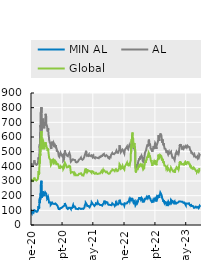
| Category | MIN AL | AL | Global |
|---|---|---|---|
| 2020-01-01 | 81 | 398 | 298 |
| 2020-01-02 | 85 | 407 | 303 |
| 2020-01-03 | 91 | 420 | 314 |
| 2020-01-06 | 87 | 416 | 311 |
| 2020-01-07 | 87 | 414 | 308 |
| 2020-01-08 | 81 | 408 | 301 |
| 2020-01-09 | 87 | 407 | 303 |
| 2020-01-10 | 89 | 406 | 304 |
| 2020-01-13 | 87 | 405 | 302 |
| 2020-01-14 | 88 | 409 | 303 |
| 2020-01-15 | 88 | 407 | 302 |
| 2020-01-16 | 85 | 404 | 299 |
| 2020-01-17 | 83 | 404 | 298 |
| 2020-01-20 | 83 | 404 | 298 |
| 2020-01-21 | 88 | 415 | 305 |
| 2020-01-22 | 89 | 419 | 305 |
| 2020-01-23 | 92 | 423 | 308 |
| 2020-01-24 | 95 | 432 | 314 |
| 2020-01-27 | 101 | 441 | 323 |
| 2020-01-28 | 95 | 433 | 315 |
| 2020-01-29 | 99 | 429 | 315 |
| 2020-01-30 | 95 | 427 | 314 |
| 2020-01-31 | 96 | 430 | 317 |
| 2020-02-03 | 97 | 427 | 314 |
| 2020-02-04 | 97 | 418 | 308 |
| 2020-02-05 | 92 | 412 | 303 |
| 2020-02-06 | 92 | 413 | 303 |
| 2020-02-07 | 96 | 413 | 308 |
| 2020-02-10 | 98 | 415 | 312 |
| 2020-02-11 | 94 | 416 | 308 |
| 2020-02-12 | 90 | 410 | 303 |
| 2020-02-13 | 91 | 415 | 305 |
| 2020-02-14 | 92 | 412 | 304 |
| 2020-02-17 | 92 | 412 | 304 |
| 2020-02-18 | 94 | 414 | 305 |
| 2020-02-19 | 91 | 408 | 302 |
| 2020-02-20 | 92 | 415 | 309 |
| 2020-02-21 | 94 | 415 | 310 |
| 2020-02-24 | 98 | 422 | 317 |
| 2020-02-25 | 104 | 430 | 325 |
| 2020-02-26 | 106 | 433 | 328 |
| 2020-02-27 | 112 | 449 | 341 |
| 2020-02-28 | 129 | 461 | 367 |
| 2020-03-02 | 126 | 454 | 362 |
| 2020-03-03 | 123 | 448 | 356 |
| 2020-03-04 | 112 | 433 | 343 |
| 2020-03-05 | 120 | 455 | 358 |
| 2020-03-06 | 139 | 477 | 387 |
| 2020-03-09 | 180 | 550 | 447 |
| 2020-03-10 | 150 | 529 | 419 |
| 2020-03-11 | 172 | 559 | 435 |
| 2020-03-12 | 191 | 627 | 489 |
| 2020-03-13 | 174 | 601 | 473 |
| 2020-03-16 | 215 | 680 | 536 |
| 2020-03-17 | 213 | 667 | 523 |
| 2020-03-18 | 274 | 767 | 588 |
| 2020-03-19 | 287 | 799 | 622 |
| 2020-03-20 | 282 | 765 | 603 |
| 2020-03-23 | 302 | 803 | 641 |
| 2020-03-24 | 276 | 760 | 606 |
| 2020-03-25 | 218 | 676 | 542 |
| 2020-03-26 | 186 | 644 | 516 |
| 2020-03-27 | 208 | 687 | 543 |
| 2020-03-30 | 208 | 692 | 560 |
| 2020-03-31 | 195 | 672 | 543 |
| 2020-04-01 | 211 | 710 | 571 |
| 2020-04-02 | 218 | 714 | 572 |
| 2020-04-03 | 229 | 725 | 579 |
| 2020-04-06 | 224 | 714 | 571 |
| 2020-04-07 | 215 | 706 | 557 |
| 2020-04-08 | 215 | 709 | 557 |
| 2020-04-09 | 207 | 674 | 532 |
| 2020-04-10 | 207 | 674 | 532 |
| 2020-04-13 | 197 | 659 | 524 |
| 2020-04-14 | 194 | 653 | 516 |
| 2020-04-15 | 213 | 685 | 541 |
| 2020-04-16 | 223 | 701 | 550 |
| 2020-04-17 | 213 | 679 | 537 |
| 2020-04-20 | 214 | 686 | 540 |
| 2020-04-21 | 223 | 710 | 557 |
| 2020-04-22 | 222 | 723 | 560 |
| 2020-04-23 | 225 | 742 | 565 |
| 2020-04-24 | 227 | 758 | 570 |
| 2020-04-27 | 220 | 762 | 566 |
| 2020-04-28 | 220 | 759 | 569 |
| 2020-04-29 | 213 | 739 | 559 |
| 2020-04-30 | 200 | 688 | 536 |
| 2020-05-01 | 197 | 690 | 538 |
| 2020-05-04 | 195 | 692 | 540 |
| 2020-05-05 | 189 | 676 | 528 |
| 2020-05-06 | 181 | 673 | 525 |
| 2020-05-07 | 187 | 667 | 528 |
| 2020-05-08 | 182 | 651 | 516 |
| 2020-05-11 | 177 | 637 | 504 |
| 2020-05-12 | 182 | 638 | 503 |
| 2020-05-13 | 193 | 654 | 512 |
| 2020-05-14 | 196 | 661 | 521 |
| 2020-05-15 | 188 | 645 | 510 |
| 2020-05-18 | 171 | 613 | 486 |
| 2020-05-19 | 169 | 613 | 483 |
| 2020-05-20 | 162 | 601 | 472 |
| 2020-05-21 | 154 | 586 | 461 |
| 2020-05-22 | 154 | 588 | 466 |
| 2020-05-25 | 154 | 588 | 466 |
| 2020-05-26 | 149 | 565 | 452 |
| 2020-05-27 | 151 | 569 | 454 |
| 2020-05-28 | 149 | 568 | 453 |
| 2020-05-29 | 155 | 567 | 456 |
| 2020-06-01 | 153 | 562 | 451 |
| 2020-06-02 | 148 | 550 | 441 |
| 2020-06-03 | 137 | 528 | 420 |
| 2020-06-04 | 136 | 531 | 418 |
| 2020-06-05 | 133 | 526 | 409 |
| 2020-06-08 | 132 | 519 | 406 |
| 2020-06-09 | 136 | 531 | 416 |
| 2020-06-10 | 145 | 538 | 424 |
| 2020-06-11 | 158 | 568 | 446 |
| 2020-06-12 | 156 | 563 | 443 |
| 2020-06-15 | 159 | 566 | 448 |
| 2020-06-16 | 147 | 545 | 428 |
| 2020-06-17 | 150 | 552 | 431 |
| 2020-06-18 | 151 | 557 | 436 |
| 2020-06-19 | 149 | 552 | 433 |
| 2020-06-22 | 149 | 551 | 432 |
| 2020-06-23 | 145 | 545 | 428 |
| 2020-06-24 | 145 | 553 | 435 |
| 2020-06-25 | 144 | 554 | 438 |
| 2020-06-26 | 151 | 560 | 442 |
| 2020-06-29 | 151 | 558 | 442 |
| 2020-06-30 | 149 | 554 | 441 |
| 2020-07-01 | 145 | 548 | 434 |
| 2020-07-02 | 143 | 543 | 430 |
| 2020-07-03 | 143 | 543 | 430 |
| 2020-07-06 | 140 | 530 | 425 |
| 2020-07-07 | 144 | 535 | 430 |
| 2020-07-08 | 143 | 532 | 429 |
| 2020-07-09 | 148 | 543 | 437 |
| 2020-07-10 | 147 | 539 | 437 |
| 2020-07-13 | 145 | 536 | 435 |
| 2020-07-14 | 147 | 544 | 441 |
| 2020-07-15 | 144 | 535 | 433 |
| 2020-07-16 | 145 | 534 | 433 |
| 2020-07-17 | 141 | 526 | 428 |
| 2020-07-20 | 138 | 518 | 423 |
| 2020-07-21 | 135 | 509 | 415 |
| 2020-07-22 | 132 | 501 | 411 |
| 2020-07-23 | 133 | 508 | 412 |
| 2020-07-24 | 135 | 510 | 416 |
| 2020-07-27 | 131 | 507 | 412 |
| 2020-07-28 | 134 | 511 | 420 |
| 2020-07-29 | 125 | 505 | 416 |
| 2020-07-30 | 125 | 506 | 421 |
| 2020-07-31 | 120 | 499 | 416 |
| 2020-08-03 | 116 | 494 | 411 |
| 2020-08-04 | 117 | 484 | 408 |
| 2020-08-05 | 109 | 472 | 400 |
| 2020-08-06 | 108 | 469 | 400 |
| 2020-08-07 | 109 | 470 | 397 |
| 2020-08-10 | 110 | 465 | 392 |
| 2020-08-11 | 109 | 461 | 383 |
| 2020-08-12 | 111 | 467 | 385 |
| 2020-08-13 | 108 | 468 | 383 |
| 2020-08-14 | 111 | 476 | 389 |
| 2020-08-17 | 113 | 480 | 395 |
| 2020-08-18 | 115 | 484 | 399 |
| 2020-08-19 | 113 | 485 | 395 |
| 2020-08-20 | 117 | 492 | 402 |
| 2020-08-21 | 118 | 489 | 400 |
| 2020-08-24 | 116 | 484 | 396 |
| 2020-08-25 | 116 | 488 | 397 |
| 2020-08-26 | 116 | 490 | 399 |
| 2020-08-27 | 117 | 489 | 395 |
| 2020-08-28 | 116 | 484 | 396 |
| 2020-08-31 | 119 | 478 | 397 |
| 2020-09-01 | 119 | 471 | 393 |
| 2020-09-02 | 119 | 469 | 389 |
| 2020-09-03 | 122 | 476 | 395 |
| 2020-09-04 | 116 | 472 | 390 |
| 2020-09-07 | 116 | 472 | 390 |
| 2020-09-08 | 118 | 478 | 397 |
| 2020-09-09 | 116 | 474 | 393 |
| 2020-09-10 | 119 | 439 | 381 |
| 2020-09-11 | 127 | 442 | 384 |
| 2020-09-14 | 127 | 443 | 385 |
| 2020-09-15 | 124 | 440 | 382 |
| 2020-09-16 | 122 | 447 | 384 |
| 2020-09-17 | 125 | 459 | 392 |
| 2020-09-18 | 125 | 464 | 395 |
| 2020-09-21 | 134 | 485 | 412 |
| 2020-09-22 | 140 | 492 | 417 |
| 2020-09-23 | 150 | 509 | 424 |
| 2020-09-24 | 149 | 504 | 426 |
| 2020-09-25 | 142 | 497 | 420 |
| 2020-09-28 | 138 | 495 | 420 |
| 2020-09-29 | 140 | 497 | 420 |
| 2020-09-30 | 135 | 486 | 412 |
| 2020-10-01 | 136 | 492 | 413 |
| 2020-10-02 | 132 | 491 | 412 |
| 2020-10-05 | 125 | 483 | 403 |
| 2020-10-06 | 127 | 486 | 405 |
| 2020-10-07 | 121 | 481 | 400 |
| 2020-10-08 | 115 | 474 | 399 |
| 2020-10-09 | 112 | 468 | 393 |
| 2020-10-12 | 112 | 468 | 393 |
| 2020-10-13 | 116 | 472 | 396 |
| 2020-10-14 | 114 | 472 | 397 |
| 2020-10-15 | 110 | 472 | 397 |
| 2020-10-16 | 109 | 469 | 395 |
| 2020-10-19 | 110 | 475 | 395 |
| 2020-10-20 | 110 | 475 | 394 |
| 2020-10-21 | 113 | 481 | 396 |
| 2020-10-22 | 114 | 480 | 397 |
| 2020-10-23 | 117 | 481 | 398 |
| 2020-10-26 | 118 | 486 | 404 |
| 2020-10-27 | 117 | 485 | 404 |
| 2020-10-28 | 119 | 492 | 410 |
| 2020-10-29 | 117 | 491 | 408 |
| 2020-10-30 | 116 | 485 | 404 |
| 2020-11-02 | 118 | 483 | 406 |
| 2020-11-03 | 114 | 475 | 400 |
| 2020-11-04 | 114 | 465 | 396 |
| 2020-11-05 | 113 | 455 | 382 |
| 2020-11-06 | 116 | 452 | 380 |
| 2020-11-09 | 109 | 432 | 356 |
| 2020-11-10 | 116 | 433 | 358 |
| 2020-11-11 | 116 | 433 | 358 |
| 2020-11-12 | 113 | 435 | 357 |
| 2020-11-13 | 114 | 434 | 355 |
| 2020-11-16 | 119 | 432 | 352 |
| 2020-11-17 | 117 | 441 | 360 |
| 2020-11-18 | 116 | 441 | 358 |
| 2020-11-19 | 118 | 445 | 360 |
| 2020-11-20 | 116 | 445 | 362 |
| 2020-11-23 | 125 | 446 | 361 |
| 2020-11-24 | 128 | 445 | 360 |
| 2020-11-25 | 131 | 448 | 361 |
| 2020-11-26 | 131 | 448 | 361 |
| 2020-11-27 | 136 | 449 | 363 |
| 2020-11-30 | 132 | 453 | 363 |
| 2020-12-01 | 123 | 444 | 354 |
| 2020-12-02 | 122 | 444 | 353 |
| 2020-12-03 | 123 | 444 | 353 |
| 2020-12-04 | 122 | 441 | 347 |
| 2020-12-07 | 126 | 448 | 353 |
| 2020-12-08 | 128 | 450 | 356 |
| 2020-12-09 | 126 | 447 | 354 |
| 2020-12-10 | 129 | 446 | 356 |
| 2020-12-11 | 129 | 443 | 355 |
| 2020-12-14 | 127 | 439 | 353 |
| 2020-12-15 | 118 | 436 | 348 |
| 2020-12-16 | 114 | 432 | 344 |
| 2020-12-17 | 111 | 429 | 340 |
| 2020-12-18 | 109 | 426 | 338 |
| 2020-12-21 | 109 | 429 | 341 |
| 2020-12-22 | 110 | 429 | 342 |
| 2020-12-23 | 107 | 425 | 338 |
| 2020-12-24 | 110 | 427 | 340 |
| 2020-12-25 | 110 | 427 | 340 |
| 2020-12-28 | 110 | 427 | 340 |
| 2020-12-29 | 109 | 427 | 338 |
| 2020-12-30 | 110 | 427 | 338 |
| 2020-12-31 | 109 | 427 | 338 |
| 2021-01-01 | 109 | 427 | 338 |
| 2021-01-04 | 108 | 433 | 340 |
| 2021-01-05 | 107 | 436 | 342 |
| 2021-01-06 | 105 | 433 | 339 |
| 2021-01-07 | 105 | 433 | 339 |
| 2021-01-08 | 102 | 432 | 337 |
| 2021-01-11 | 107 | 438 | 341 |
| 2021-01-12 | 115 | 446 | 349 |
| 2021-01-13 | 112 | 450 | 350 |
| 2021-01-14 | 110 | 449 | 346 |
| 2021-01-15 | 112 | 452 | 351 |
| 2021-01-18 | 112 | 452 | 351 |
| 2021-01-19 | 112 | 451 | 350 |
| 2021-01-20 | 112 | 450 | 349 |
| 2021-01-21 | 110 | 452 | 348 |
| 2021-01-22 | 109 | 451 | 350 |
| 2021-01-25 | 110 | 454 | 353 |
| 2021-01-26 | 109 | 454 | 352 |
| 2021-01-27 | 111 | 459 | 355 |
| 2021-01-28 | 109 | 456 | 353 |
| 2021-01-29 | 105 | 452 | 349 |
| 2021-02-01 | 109 | 452 | 349 |
| 2021-02-02 | 108 | 449 | 346 |
| 2021-02-03 | 110 | 452 | 346 |
| 2021-02-04 | 115 | 451 | 345 |
| 2021-02-05 | 112 | 446 | 339 |
| 2021-02-08 | 113 | 445 | 341 |
| 2021-02-09 | 112 | 446 | 341 |
| 2021-02-10 | 114 | 448 | 343 |
| 2021-02-11 | 111 | 446 | 340 |
| 2021-02-12 | 110 | 444 | 337 |
| 2021-02-15 | 110 | 444 | 337 |
| 2021-02-16 | 112 | 452 | 342 |
| 2021-02-17 | 113 | 450 | 344 |
| 2021-02-18 | 115 | 452 | 344 |
| 2021-02-19 | 114 | 453 | 343 |
| 2021-02-22 | 118 | 464 | 351 |
| 2021-02-23 | 123 | 467 | 355 |
| 2021-02-24 | 123 | 463 | 352 |
| 2021-02-25 | 125 | 468 | 352 |
| 2021-02-26 | 133 | 475 | 365 |
| 2021-03-01 | 129 | 470 | 357 |
| 2021-03-02 | 135 | 477 | 362 |
| 2021-03-03 | 136 | 477 | 361 |
| 2021-03-04 | 143 | 478 | 361 |
| 2021-03-05 | 152 | 493 | 374 |
| 2021-03-08 | 157 | 506 | 385 |
| 2021-03-09 | 155 | 508 | 387 |
| 2021-03-10 | 151 | 500 | 382 |
| 2021-03-11 | 144 | 492 | 370 |
| 2021-03-12 | 138 | 484 | 366 |
| 2021-03-15 | 137 | 480 | 365 |
| 2021-03-16 | 131 | 471 | 358 |
| 2021-03-17 | 131 | 469 | 360 |
| 2021-03-18 | 129 | 468 | 356 |
| 2021-03-19 | 127 | 465 | 353 |
| 2021-03-22 | 131 | 465 | 366 |
| 2021-03-23 | 131 | 466 | 370 |
| 2021-03-24 | 133 | 474 | 373 |
| 2021-03-25 | 132 | 478 | 374 |
| 2021-03-26 | 130 | 477 | 373 |
| 2021-03-29 | 125 | 476 | 369 |
| 2021-03-30 | 131 | 481 | 377 |
| 2021-03-31 | 125 | 471 | 370 |
| 2021-04-01 | 124 | 469 | 369 |
| 2021-04-02 | 124 | 469 | 369 |
| 2021-04-05 | 121 | 465 | 365 |
| 2021-04-06 | 121 | 467 | 368 |
| 2021-04-07 | 122 | 470 | 368 |
| 2021-04-08 | 124 | 473 | 370 |
| 2021-04-09 | 125 | 473 | 367 |
| 2021-04-12 | 133 | 471 | 366 |
| 2021-04-13 | 138 | 475 | 372 |
| 2021-04-14 | 134 | 470 | 364 |
| 2021-04-15 | 135 | 472 | 368 |
| 2021-04-16 | 130 | 469 | 361 |
| 2021-04-19 | 136 | 469 | 357 |
| 2021-04-20 | 147 | 476 | 366 |
| 2021-04-21 | 155 | 477 | 366 |
| 2021-04-22 | 160 | 478 | 365 |
| 2021-04-23 | 152 | 476 | 364 |
| 2021-04-26 | 157 | 476 | 366 |
| 2021-04-27 | 154 | 474 | 363 |
| 2021-04-28 | 150 | 474 | 366 |
| 2021-04-29 | 144 | 471 | 363 |
| 2021-04-30 | 138 | 465 | 360 |
| 2021-05-03 | 138 | 469 | 362 |
| 2021-05-04 | 141 | 469 | 363 |
| 2021-05-05 | 149 | 472 | 364 |
| 2021-05-06 | 149 | 470 | 362 |
| 2021-05-07 | 137 | 462 | 354 |
| 2021-05-10 | 133 | 458 | 350 |
| 2021-05-11 | 132 | 462 | 353 |
| 2021-05-12 | 131 | 463 | 352 |
| 2021-05-13 | 130 | 462 | 356 |
| 2021-05-14 | 129 | 458 | 352 |
| 2021-05-17 | 127 | 455 | 349 |
| 2021-05-18 | 126 | 453 | 348 |
| 2021-05-19 | 130 | 456 | 349 |
| 2021-05-20 | 133 | 460 | 353 |
| 2021-05-21 | 139 | 462 | 353 |
| 2021-05-24 | 147 | 464 | 354 |
| 2021-05-25 | 150 | 467 | 356 |
| 2021-05-26 | 146 | 462 | 353 |
| 2021-05-27 | 145 | 460 | 350 |
| 2021-05-28 | 143 | 459 | 351 |
| 2021-05-31 | 143 | 459 | 351 |
| 2021-06-01 | 142 | 457 | 349 |
| 2021-06-02 | 142 | 454 | 348 |
| 2021-06-03 | 140 | 457 | 349 |
| 2021-06-04 | 142 | 459 | 353 |
| 2021-06-07 | 156 | 460 | 352 |
| 2021-06-08 | 152 | 457 | 351 |
| 2021-06-09 | 149 | 454 | 348 |
| 2021-06-10 | 151 | 456 | 349 |
| 2021-06-11 | 147 | 452 | 345 |
| 2021-06-14 | 145 | 454 | 345 |
| 2021-06-15 | 145 | 457 | 348 |
| 2021-06-16 | 144 | 455 | 345 |
| 2021-06-17 | 143 | 456 | 351 |
| 2021-06-18 | 148 | 461 | 353 |
| 2021-06-21 | 142 | 461 | 351 |
| 2021-06-22 | 144 | 465 | 355 |
| 2021-06-23 | 142 | 464 | 352 |
| 2021-06-24 | 141 | 467 | 354 |
| 2021-06-25 | 137 | 466 | 351 |
| 2021-06-28 | 137 | 469 | 355 |
| 2021-06-29 | 137 | 470 | 356 |
| 2021-06-30 | 134 | 463 | 356 |
| 2021-07-01 | 134 | 463 | 356 |
| 2021-07-02 | 137 | 467 | 360 |
| 2021-07-05 | 137 | 467 | 360 |
| 2021-07-06 | 137 | 472 | 364 |
| 2021-07-07 | 139 | 472 | 365 |
| 2021-07-08 | 138 | 474 | 368 |
| 2021-07-09 | 134 | 471 | 363 |
| 2021-07-12 | 134 | 472 | 362 |
| 2021-07-13 | 132 | 470 | 360 |
| 2021-07-14 | 133 | 471 | 363 |
| 2021-07-15 | 137 | 474 | 365 |
| 2021-07-16 | 135 | 471 | 363 |
| 2021-07-19 | 143 | 480 | 374 |
| 2021-07-20 | 141 | 477 | 370 |
| 2021-07-21 | 141 | 476 | 366 |
| 2021-07-22 | 143 | 478 | 369 |
| 2021-07-23 | 143 | 475 | 367 |
| 2021-07-26 | 144 | 477 | 368 |
| 2021-07-27 | 151 | 485 | 374 |
| 2021-07-28 | 154 | 485 | 374 |
| 2021-07-29 | 158 | 482 | 371 |
| 2021-07-30 | 166 | 476 | 368 |
| 2021-08-02 | 162 | 477 | 369 |
| 2021-08-03 | 156 | 476 | 368 |
| 2021-08-04 | 155 | 475 | 367 |
| 2021-08-05 | 151 | 470 | 364 |
| 2021-08-06 | 148 | 469 | 361 |
| 2021-08-09 | 148 | 470 | 362 |
| 2021-08-10 | 152 | 469 | 360 |
| 2021-08-11 | 153 | 470 | 362 |
| 2021-08-12 | 152 | 465 | 357 |
| 2021-08-13 | 157 | 471 | 362 |
| 2021-08-16 | 158 | 476 | 364 |
| 2021-08-17 | 157 | 475 | 363 |
| 2021-08-18 | 155 | 475 | 364 |
| 2021-08-19 | 156 | 480 | 368 |
| 2021-08-20 | 153 | 478 | 366 |
| 2021-08-23 | 154 | 475 | 365 |
| 2021-08-24 | 147 | 469 | 360 |
| 2021-08-25 | 142 | 463 | 354 |
| 2021-08-26 | 146 | 464 | 356 |
| 2021-08-27 | 145 | 463 | 356 |
| 2021-08-30 | 144 | 457 | 354 |
| 2021-08-31 | 138 | 458 | 350 |
| 2021-09-01 | 138 | 456 | 349 |
| 2021-09-02 | 141 | 455 | 349 |
| 2021-09-03 | 138 | 455 | 348 |
| 2021-09-06 | 138 | 455 | 348 |
| 2021-09-07 | 135 | 453 | 346 |
| 2021-09-08 | 138 | 459 | 350 |
| 2021-09-09 | 138 | 463 | 354 |
| 2021-09-10 | 137 | 462 | 351 |
| 2021-09-13 | 138 | 459 | 352 |
| 2021-09-14 | 143 | 465 | 357 |
| 2021-09-15 | 138 | 460 | 353 |
| 2021-09-16 | 136 | 460 | 353 |
| 2021-09-17 | 134 | 461 | 354 |
| 2021-09-20 | 142 | 477 | 367 |
| 2021-09-21 | 140 | 477 | 365 |
| 2021-09-22 | 140 | 479 | 367 |
| 2021-09-23 | 134 | 475 | 362 |
| 2021-09-24 | 135 | 481 | 367 |
| 2021-09-27 | 136 | 485 | 370 |
| 2021-09-28 | 137 | 486 | 371 |
| 2021-09-29 | 140 | 484 | 369 |
| 2021-09-30 | 148 | 489 | 373 |
| 2021-10-01 | 153 | 492 | 379 |
| 2021-10-04 | 153 | 493 | 379 |
| 2021-10-05 | 151 | 488 | 377 |
| 2021-10-06 | 153 | 490 | 382 |
| 2021-10-07 | 141 | 484 | 373 |
| 2021-10-08 | 139 | 485 | 374 |
| 2021-10-11 | 139 | 485 | 374 |
| 2021-10-12 | 143 | 489 | 380 |
| 2021-10-13 | 142 | 488 | 378 |
| 2021-10-14 | 139 | 486 | 377 |
| 2021-10-15 | 139 | 483 | 371 |
| 2021-10-18 | 141 | 486 | 374 |
| 2021-10-19 | 134 | 481 | 367 |
| 2021-10-20 | 130 | 483 | 369 |
| 2021-10-21 | 130 | 487 | 371 |
| 2021-10-22 | 129 | 490 | 374 |
| 2021-10-25 | 128 | 490 | 374 |
| 2021-10-26 | 132 | 489 | 373 |
| 2021-10-27 | 135 | 489 | 375 |
| 2021-10-28 | 141 | 493 | 374 |
| 2021-10-29 | 150 | 498 | 381 |
| 2021-11-01 | 150 | 502 | 381 |
| 2021-11-02 | 152 | 507 | 385 |
| 2021-11-03 | 143 | 502 | 379 |
| 2021-11-04 | 147 | 505 | 381 |
| 2021-11-05 | 150 | 504 | 380 |
| 2021-11-08 | 142 | 493 | 367 |
| 2021-11-09 | 145 | 496 | 373 |
| 2021-11-10 | 142 | 495 | 368 |
| 2021-11-11 | 142 | 495 | 368 |
| 2021-11-12 | 143 | 495 | 371 |
| 2021-11-15 | 140 | 489 | 366 |
| 2021-11-16 | 141 | 493 | 371 |
| 2021-11-17 | 143 | 496 | 375 |
| 2021-11-18 | 144 | 500 | 378 |
| 2021-11-19 | 146 | 500 | 380 |
| 2021-11-22 | 143 | 501 | 378 |
| 2021-11-23 | 147 | 509 | 387 |
| 2021-11-24 | 153 | 516 | 391 |
| 2021-11-25 | 153 | 516 | 391 |
| 2021-11-26 | 172 | 543 | 415 |
| 2021-11-29 | 164 | 538 | 410 |
| 2021-11-30 | 164 | 543 | 414 |
| 2021-12-01 | 160 | 527 | 408 |
| 2021-12-02 | 156 | 520 | 401 |
| 2021-12-03 | 161 | 519 | 405 |
| 2021-12-06 | 153 | 510 | 394 |
| 2021-12-07 | 145 | 497 | 383 |
| 2021-12-08 | 141 | 495 | 377 |
| 2021-12-09 | 141 | 496 | 381 |
| 2021-12-10 | 139 | 499 | 383 |
| 2021-12-13 | 143 | 504 | 389 |
| 2021-12-14 | 141 | 501 | 388 |
| 2021-12-15 | 140 | 501 | 387 |
| 2021-12-16 | 142 | 506 | 391 |
| 2021-12-17 | 144 | 508 | 397 |
| 2021-12-20 | 144 | 514 | 404 |
| 2021-12-21 | 143 | 511 | 400 |
| 2021-12-22 | 146 | 513 | 402 |
| 2021-12-23 | 142 | 510 | 394 |
| 2021-12-24 | 142 | 510 | 394 |
| 2021-12-27 | 143 | 508 | 394 |
| 2021-12-28 | 142 | 504 | 392 |
| 2021-12-29 | 136 | 497 | 385 |
| 2021-12-30 | 139 | 500 | 388 |
| 2021-12-31 | 140 | 492 | 386 |
| 2022-01-03 | 132 | 487 | 378 |
| 2022-01-04 | 135 | 494 | 382 |
| 2022-01-05 | 139 | 498 | 383 |
| 2022-01-06 | 148 | 508 | 394 |
| 2022-01-07 | 148 | 512 | 396 |
| 2022-01-10 | 152 | 517 | 403 |
| 2022-01-11 | 153 | 518 | 402 |
| 2022-01-12 | 150 | 516 | 399 |
| 2022-01-13 | 152 | 522 | 408 |
| 2022-01-14 | 146 | 522 | 409 |
| 2022-01-17 | 146 | 522 | 409 |
| 2022-01-18 | 148 | 526 | 415 |
| 2022-01-19 | 148 | 523 | 413 |
| 2022-01-20 | 144 | 522 | 410 |
| 2022-01-21 | 150 | 529 | 415 |
| 2022-01-24 | 148 | 535 | 425 |
| 2022-01-25 | 146 | 531 | 423 |
| 2022-01-26 | 143 | 525 | 415 |
| 2022-01-27 | 151 | 531 | 416 |
| 2022-01-28 | 156 | 522 | 417 |
| 2022-01-31 | 154 | 520 | 413 |
| 2022-02-01 | 161 | 521 | 412 |
| 2022-02-02 | 159 | 517 | 407 |
| 2022-02-03 | 157 | 519 | 407 |
| 2022-02-04 | 157 | 524 | 409 |
| 2022-02-07 | 161 | 529 | 414 |
| 2022-02-08 | 162 | 527 | 413 |
| 2022-02-09 | 160 | 522 | 405 |
| 2022-02-10 | 159 | 524 | 400 |
| 2022-02-11 | 174 | 543 | 421 |
| 2022-02-14 | 171 | 541 | 424 |
| 2022-02-15 | 162 | 530 | 413 |
| 2022-02-16 | 164 | 530 | 413 |
| 2022-02-17 | 168 | 537 | 424 |
| 2022-02-18 | 172 | 536 | 428 |
| 2022-02-21 | 172 | 536 | 428 |
| 2022-02-22 | 178 | 542 | 440 |
| 2022-02-23 | 180 | 547 | 458 |
| 2022-02-24 | 180 | 549 | 530 |
| 2022-02-25 | 175 | 543 | 486 |
| 2022-02-28 | 181 | 552 | 556 |
| 2022-03-01 | 180 | 556 | 583 |
| 2022-03-02 | 170 | 550 | 575 |
| 2022-03-03 | 173 | 555 | 559 |
| 2022-03-04 | 184 | 575 | 606 |
| 2022-03-07 | 185 | 583 | 619 |
| 2022-03-08 | 184 | 582 | 631 |
| 2022-03-09 | 173 | 559 | 606 |
| 2022-03-10 | 170 | 552 | 597 |
| 2022-03-11 | 168 | 550 | 596 |
| 2022-03-14 | 165 | 547 | 589 |
| 2022-03-15 | 166 | 547 | 583 |
| 2022-03-16 | 166 | 536 | 551 |
| 2022-03-17 | 152 | 520 | 527 |
| 2022-03-18 | 152 | 522 | 539 |
| 2022-03-21 | 150 | 523 | 539 |
| 2022-03-22 | 149 | 522 | 541 |
| 2022-03-23 | 159 | 536 | 558 |
| 2022-03-24 | 152 | 523 | 552 |
| 2022-03-25 | 146 | 512 | 536 |
| 2022-03-28 | 147 | 505 | 528 |
| 2022-03-29 | 142 | 499 | 513 |
| 2022-03-30 | 139 | 498 | 515 |
| 2022-03-31 | 134 | 399 | 368 |
| 2022-04-01 | 136 | 399 | 370 |
| 2022-04-04 | 131 | 389 | 362 |
| 2022-04-05 | 130 | 387 | 358 |
| 2022-04-06 | 140 | 396 | 368 |
| 2022-04-07 | 146 | 398 | 367 |
| 2022-04-08 | 157 | 405 | 371 |
| 2022-04-11 | 162 | 415 | 379 |
| 2022-04-12 | 162 | 417 | 385 |
| 2022-04-13 | 156 | 413 | 384 |
| 2022-04-14 | 148 | 405 | 375 |
| 2022-04-15 | 148 | 405 | 375 |
| 2022-04-18 | 148 | 408 | 376 |
| 2022-04-19 | 151 | 411 | 380 |
| 2022-04-20 | 160 | 416 | 387 |
| 2022-04-21 | 165 | 424 | 388 |
| 2022-04-22 | 170 | 435 | 396 |
| 2022-04-25 | 173 | 434 | 403 |
| 2022-04-26 | 173 | 437 | 408 |
| 2022-04-27 | 170 | 433 | 405 |
| 2022-04-28 | 178 | 440 | 411 |
| 2022-04-29 | 180 | 446 | 394 |
| 2022-05-02 | 190 | 456 | 395 |
| 2022-05-03 | 184 | 446 | 397 |
| 2022-05-04 | 182 | 440 | 396 |
| 2022-05-05 | 175 | 440 | 391 |
| 2022-05-06 | 172 | 442 | 393 |
| 2022-05-09 | 188 | 466 | 414 |
| 2022-05-10 | 183 | 460 | 414 |
| 2022-05-11 | 183 | 456 | 414 |
| 2022-05-12 | 182 | 461 | 416 |
| 2022-05-13 | 175 | 456 | 410 |
| 2022-05-16 | 176 | 462 | 415 |
| 2022-05-17 | 172 | 458 | 406 |
| 2022-05-18 | 185 | 473 | 418 |
| 2022-05-19 | 182 | 470 | 419 |
| 2022-05-20 | 188 | 474 | 421 |
| 2022-05-23 | 180 | 462 | 407 |
| 2022-05-24 | 184 | 466 | 415 |
| 2022-05-25 | 176 | 452 | 405 |
| 2022-05-26 | 169 | 446 | 398 |
| 2022-05-27 | 159 | 438 | 391 |
| 2022-05-30 | 159 | 438 | 391 |
| 2022-05-31 | 154 | 432 | 378 |
| 2022-06-01 | 154 | 431 | 378 |
| 2022-06-02 | 157 | 432 | 378 |
| 2022-06-03 | 159 | 434 | 377 |
| 2022-06-06 | 159 | 437 | 375 |
| 2022-06-07 | 161 | 441 | 384 |
| 2022-06-08 | 159 | 445 | 387 |
| 2022-06-09 | 164 | 459 | 398 |
| 2022-06-10 | 166 | 463 | 403 |
| 2022-06-13 | 179 | 487 | 419 |
| 2022-06-14 | 177 | 486 | 414 |
| 2022-06-15 | 176 | 483 | 419 |
| 2022-06-16 | 183 | 497 | 433 |
| 2022-06-17 | 184 | 496 | 429 |
| 2022-06-20 | 184 | 496 | 429 |
| 2022-06-21 | 178 | 495 | 423 |
| 2022-06-22 | 184 | 508 | 436 |
| 2022-06-23 | 182 | 506 | 435 |
| 2022-06-24 | 178 | 504 | 432 |
| 2022-06-27 | 178 | 509 | 430 |
| 2022-06-28 | 192 | 531 | 447 |
| 2022-06-29 | 196 | 534 | 458 |
| 2022-06-30 | 189 | 534 | 461 |
| 2022-07-01 | 189 | 528 | 458 |
| 2022-07-04 | 189 | 528 | 458 |
| 2022-07-05 | 191 | 549 | 469 |
| 2022-07-06 | 181 | 545 | 463 |
| 2022-07-07 | 177 | 537 | 458 |
| 2022-07-08 | 177 | 537 | 457 |
| 2022-07-11 | 187 | 549 | 471 |
| 2022-07-12 | 193 | 562 | 480 |
| 2022-07-13 | 201 | 574 | 494 |
| 2022-07-14 | 204 | 582 | 499 |
| 2022-07-15 | 204 | 582 | 498 |
| 2022-07-18 | 197 | 571 | 486 |
| 2022-07-19 | 188 | 553 | 475 |
| 2022-07-20 | 185 | 539 | 463 |
| 2022-07-21 | 194 | 554 | 472 |
| 2022-07-22 | 194 | 552 | 471 |
| 2022-07-25 | 187 | 547 | 464 |
| 2022-07-26 | 186 | 549 | 467 |
| 2022-07-27 | 179 | 537 | 464 |
| 2022-07-28 | 176 | 524 | 454 |
| 2022-07-29 | 169 | 522 | 443 |
| 2022-08-01 | 174 | 530 | 446 |
| 2022-08-02 | 167 | 523 | 434 |
| 2022-08-03 | 174 | 525 | 443 |
| 2022-08-04 | 164 | 514 | 435 |
| 2022-08-05 | 161 | 509 | 424 |
| 2022-08-08 | 164 | 505 | 425 |
| 2022-08-09 | 171 | 520 | 427 |
| 2022-08-10 | 160 | 506 | 417 |
| 2022-08-11 | 153 | 499 | 403 |
| 2022-08-12 | 158 | 507 | 413 |
| 2022-08-15 | 159 | 508 | 416 |
| 2022-08-16 | 164 | 512 | 420 |
| 2022-08-17 | 169 | 520 | 424 |
| 2022-08-18 | 167 | 519 | 419 |
| 2022-08-19 | 173 | 528 | 423 |
| 2022-08-22 | 178 | 539 | 431 |
| 2022-08-23 | 172 | 530 | 424 |
| 2022-08-24 | 165 | 518 | 414 |
| 2022-08-25 | 168 | 516 | 417 |
| 2022-08-26 | 171 | 523 | 421 |
| 2022-08-29 | 175 | 534 | 423 |
| 2022-08-30 | 179 | 534 | 428 |
| 2022-08-31 | 177 | 549 | 433 |
| 2022-09-01 | 179 | 555 | 441 |
| 2022-09-02 | 182 | 559 | 442 |
| 2022-09-05 | 182 | 559 | 442 |
| 2022-09-06 | 184 | 553 | 436 |
| 2022-09-07 | 183 | 550 | 439 |
| 2022-09-08 | 172 | 539 | 426 |
| 2022-09-09 | 166 | 526 | 418 |
| 2022-09-12 | 160 | 519 | 408 |
| 2022-09-13 | 173 | 533 | 418 |
| 2022-09-14 | 185 | 540 | 424 |
| 2022-09-15 | 185 | 535 | 423 |
| 2022-09-16 | 192 | 548 | 433 |
| 2022-09-19 | 190 | 543 | 430 |
| 2022-09-20 | 190 | 548 | 433 |
| 2022-09-21 | 184 | 546 | 435 |
| 2022-09-22 | 179 | 548 | 432 |
| 2022-09-23 | 188 | 565 | 447 |
| 2022-09-26 | 195 | 582 | 453 |
| 2022-09-27 | 201 | 600 | 461 |
| 2022-09-28 | 205 | 601 | 480 |
| 2022-09-29 | 208 | 613 | 486 |
| 2022-09-30 | 206 | 608 | 467 |
| 2022-10-03 | 201 | 596 | 469 |
| 2022-10-04 | 184 | 573 | 448 |
| 2022-10-05 | 193 | 586 | 455 |
| 2022-10-06 | 195 | 586 | 452 |
| 2022-10-07 | 205 | 596 | 459 |
| 2022-10-10 | 205 | 596 | 459 |
| 2022-10-11 | 212 | 610 | 468 |
| 2022-10-12 | 217 | 617 | 477 |
| 2022-10-13 | 221 | 624 | 481 |
| 2022-10-14 | 220 | 626 | 478 |
| 2022-10-17 | 216 | 615 | 473 |
| 2022-10-18 | 213 | 608 | 471 |
| 2022-10-19 | 213 | 615 | 471 |
| 2022-10-20 | 213 | 613 | 471 |
| 2022-10-21 | 213 | 607 | 477 |
| 2022-10-24 | 200 | 588 | 465 |
| 2022-10-25 | 196 | 574 | 457 |
| 2022-10-26 | 190 | 574 | 449 |
| 2022-10-27 | 192 | 576 | 453 |
| 2022-10-28 | 181 | 561 | 439 |
| 2022-10-31 | 187 | 583 | 451 |
| 2022-11-01 | 180 | 569 | 444 |
| 2022-11-02 | 179 | 570 | 444 |
| 2022-11-03 | 179 | 573 | 448 |
| 2022-11-04 | 170 | 563 | 438 |
| 2022-11-07 | 158 | 543 | 422 |
| 2022-11-08 | 160 | 542 | 424 |
| 2022-11-09 | 169 | 558 | 433 |
| 2022-11-10 | 158 | 543 | 425 |
| 2022-11-11 | 158 | 543 | 425 |
| 2022-11-14 | 150 | 529 | 405 |
| 2022-11-15 | 149 | 521 | 402 |
| 2022-11-16 | 156 | 521 | 404 |
| 2022-11-17 | 158 | 526 | 408 |
| 2022-11-18 | 157 | 526 | 406 |
| 2022-11-21 | 153 | 521 | 406 |
| 2022-11-22 | 152 | 517 | 404 |
| 2022-11-23 | 155 | 518 | 404 |
| 2022-11-24 | 155 | 518 | 404 |
| 2022-11-25 | 155 | 518 | 398 |
| 2022-11-28 | 150 | 514 | 394 |
| 2022-11-29 | 142 | 501 | 385 |
| 2022-11-30 | 144 | 496 | 386 |
| 2022-12-01 | 145 | 491 | 384 |
| 2022-12-02 | 146 | 489 | 385 |
| 2022-12-05 | 142 | 490 | 379 |
| 2022-12-06 | 150 | 507 | 391 |
| 2022-12-07 | 151 | 504 | 396 |
| 2022-12-08 | 137 | 493 | 384 |
| 2022-12-09 | 129 | 487 | 376 |
| 2022-12-12 | 135 | 488 | 376 |
| 2022-12-13 | 133 | 482 | 373 |
| 2022-12-14 | 148 | 486 | 377 |
| 2022-12-15 | 152 | 489 | 380 |
| 2022-12-16 | 158 | 495 | 384 |
| 2022-12-19 | 159 | 497 | 382 |
| 2022-12-20 | 160 | 497 | 382 |
| 2022-12-21 | 150 | 486 | 378 |
| 2022-12-22 | 148 | 486 | 375 |
| 2022-12-23 | 144 | 488 | 374 |
| 2022-12-26 | 144 | 488 | 374 |
| 2022-12-27 | 143 | 485 | 368 |
| 2022-12-28 | 142 | 486 | 368 |
| 2022-12-29 | 147 | 491 | 375 |
| 2022-12-30 | 147 | 490 | 375 |
| 2023-01-02 | 147 | 490 | 375 |
| 2023-01-03 | 153 | 492 | 381 |
| 2023-01-04 | 161 | 490 | 383 |
| 2023-01-05 | 171 | 499 | 390 |
| 2023-01-06 | 166 | 490 | 390 |
| 2023-01-09 | 165 | 487 | 388 |
| 2023-01-10 | 167 | 486 | 387 |
| 2023-01-11 | 164 | 480 | 388 |
| 2023-01-12 | 153 | 471 | 387 |
| 2023-01-13 | 152 | 465 | 377 |
| 2023-01-16 | 152 | 465 | 377 |
| 2023-01-17 | 156 | 458 | 371 |
| 2023-01-18 | 157 | 453 | 371 |
| 2023-01-19 | 161 | 460 | 372 |
| 2023-01-20 | 159 | 456 | 367 |
| 2023-01-23 | 159 | 454 | 364 |
| 2023-01-24 | 161 | 456 | 368 |
| 2023-01-25 | 159 | 459 | 370 |
| 2023-01-26 | 152 | 454 | 366 |
| 2023-01-27 | 149 | 454 | 366 |
| 2023-01-30 | 156 | 463 | 371 |
| 2023-01-31 | 158 | 465 | 374 |
| 2023-02-01 | 159 | 460 | 373 |
| 2023-02-02 | 148 | 443 | 356 |
| 2023-02-03 | 145 | 446 | 357 |
| 2023-02-06 | 144 | 464 | 366 |
| 2023-02-07 | 144 | 470 | 370 |
| 2023-02-08 | 150 | 475 | 378 |
| 2023-02-09 | 150 | 477 | 376 |
| 2023-02-10 | 153 | 485 | 384 |
| 2023-02-13 | 152 | 482 | 385 |
| 2023-02-14 | 146 | 480 | 381 |
| 2023-02-15 | 148 | 487 | 384 |
| 2023-02-16 | 144 | 490 | 382 |
| 2023-02-17 | 150 | 500 | 393 |
| 2023-02-20 | 150 | 500 | 393 |
| 2023-02-21 | 147 | 504 | 392 |
| 2023-02-22 | 151 | 500 | 393 |
| 2023-02-23 | 149 | 487 | 385 |
| 2023-02-24 | 150 | 489 | 383 |
| 2023-02-27 | 152 | 492 | 384 |
| 2023-02-28 | 153 | 494 | 387 |
| 2023-03-01 | 153 | 501 | 389 |
| 2023-03-02 | 154 | 504 | 392 |
| 2023-03-03 | 152 | 494 | 390 |
| 2023-03-06 | 148 | 487 | 380 |
| 2023-03-07 | 151 | 492 | 384 |
| 2023-03-08 | 152 | 495 | 387 |
| 2023-03-09 | 158 | 503 | 396 |
| 2023-03-10 | 161 | 516 | 409 |
| 2023-03-13 | 164 | 529 | 415 |
| 2023-03-14 | 155 | 523 | 409 |
| 2023-03-15 | 166 | 546 | 430 |
| 2023-03-16 | 157 | 535 | 418 |
| 2023-03-17 | 165 | 552 | 433 |
| 2023-03-20 | 160 | 548 | 428 |
| 2023-03-21 | 156 | 536 | 417 |
| 2023-03-22 | 166 | 548 | 430 |
| 2023-03-23 | 165 | 547 | 427 |
| 2023-03-24 | 163 | 549 | 428 |
| 2023-03-27 | 154 | 538 | 415 |
| 2023-03-28 | 159 | 543 | 418 |
| 2023-03-29 | 157 | 531 | 414 |
| 2023-03-30 | 158 | 529 | 413 |
| 2023-03-31 | 158 | 522 | 414 |
| 2023-04-03 | 154 | 515 | 410 |
| 2023-04-04 | 159 | 524 | 415 |
| 2023-04-05 | 159 | 530 | 419 |
| 2023-04-06 | 159 | 535 | 421 |
| 2023-04-07 | 154 | 528 | 414 |
| 2023-04-10 | 153 | 529 | 415 |
| 2023-04-11 | 153 | 528 | 416 |
| 2023-04-12 | 151 | 526 | 416 |
| 2023-04-13 | 149 | 523 | 412 |
| 2023-04-14 | 147 | 519 | 407 |
| 2023-04-17 | 147 | 521 | 408 |
| 2023-04-18 | 148 | 526 | 413 |
| 2023-04-19 | 151 | 535 | 420 |
| 2023-04-20 | 153 | 538 | 425 |
| 2023-04-21 | 149 | 534 | 422 |
| 2023-04-24 | 149 | 535 | 427 |
| 2023-04-25 | 147 | 535 | 428 |
| 2023-04-26 | 143 | 535 | 425 |
| 2023-04-27 | 140 | 530 | 419 |
| 2023-04-28 | 140 | 533 | 419 |
| 2023-05-01 | 135 | 529 | 410 |
| 2023-05-02 | 147 | 539 | 425 |
| 2023-05-03 | 148 | 538 | 425 |
| 2023-05-04 | 148 | 541 | 427 |
| 2023-05-05 | 148 | 533 | 423 |
| 2023-05-08 | 147 | 533 | 418 |
| 2023-05-09 | 147 | 528 | 417 |
| 2023-05-10 | 147 | 531 | 422 |
| 2023-05-11 | 147 | 531 | 420 |
| 2023-05-12 | 145 | 533 | 417 |
| 2023-05-15 | 147 | 540 | 429 |
| 2023-05-16 | 146 | 537 | 428 |
| 2023-05-17 | 148 | 538 | 429 |
| 2023-05-18 | 145 | 535 | 427 |
| 2023-05-19 | 145 | 534 | 425 |
| 2023-05-22 | 146 | 533 | 424 |
| 2023-05-23 | 150 | 535 | 428 |
| 2023-05-24 | 149 | 535 | 424 |
| 2023-05-25 | 146 | 530 | 420 |
| 2023-05-26 | 148 | 533 | 423 |
| 2023-05-29 | 148 | 533 | 423 |
| 2023-05-30 | 148 | 531 | 421 |
| 2023-05-31 | 150 | 530 | 420 |
| 2023-06-01 | 143 | 532 | 423 |
| 2023-06-02 | 135 | 519 | 407 |
| 2023-06-05 | 141 | 520 | 407 |
| 2023-06-06 | 141 | 510 | 402 |
| 2023-06-07 | 139 | 504 | 394 |
| 2023-06-08 | 139 | 508 | 403 |
| 2023-06-09 | 138 | 505 | 398 |
| 2023-06-12 | 137 | 502 | 396 |
| 2023-06-13 | 129 | 493 | 386 |
| 2023-06-14 | 131 | 495 | 388 |
| 2023-06-15 | 133 | 499 | 394 |
| 2023-06-16 | 131 | 496 | 390 |
| 2023-06-19 | 131 | 496 | 390 |
| 2023-06-20 | 131 | 498 | 395 |
| 2023-06-21 | 130 | 493 | 392 |
| 2023-06-22 | 124 | 485 | 384 |
| 2023-06-23 | 128 | 490 | 388 |
| 2023-06-26 | 128 | 484 | 384 |
| 2023-06-27 | 126 | 482 | 381 |
| 2023-06-28 | 130 | 486 | 386 |
| 2023-06-29 | 128 | 485 | 382 |
| 2023-06-30 | 123 | 481 | 390 |
| 2023-07-03 | 118 | 474 | 384 |
| 2023-07-04 | 118 | 474 | 384 |
| 2023-07-05 | 115 | 469 | 379 |
| 2023-07-06 | 118 | 479 | 387 |
| 2023-07-07 | 120 | 482 | 390 |
| 2023-07-10 | 121 | 480 | 392 |
| 2023-07-11 | 118 | 471 | 382 |
| 2023-07-12 | 120 | 473 | 382 |
| 2023-07-13 | 121 | 468 | 379 |
| 2023-07-14 | 119 | 467 | 374 |
| 2023-07-17 | 121 | 467 | 374 |
| 2023-07-18 | 120 | 462 | 370 |
| 2023-07-19 | 125 | 467 | 374 |
| 2023-07-20 | 126 | 468 | 373 |
| 2023-07-21 | 127 | 465 | 371 |
| 2023-07-24 | 127 | 460 | 367 |
| 2023-07-25 | 129 | 462 | 369 |
| 2023-07-26 | 127 | 464 | 370 |
| 2023-07-27 | 119 | 460 | 361 |
| 2023-07-28 | 123 | 460 | 363 |
| 2023-07-31 | 117 | 457 | 360 |
| 2023-08-01 | 116 | 460 | 362 |
| 2023-08-02 | 118 | 467 | 370 |
| 2023-08-03 | 118 | 470 | 370 |
| 2023-08-04 | 123 | 471 | 374 |
| 2023-08-07 | 120 | 470 | 371 |
| 2023-08-08 | 120 | 472 | 372 |
| 2023-08-09 | 121 | 468 | 372 |
| 2023-08-10 | 115 | 457 | 361 |
| 2023-08-11 | 115 | 455 | 359 |
| 2023-08-14 | 117 | 467 | 369 |
| 2023-08-15 | 123 | 482 | 381 |
| 2023-08-16 | 123 | 481 | 378 |
| 2023-08-17 | 129 | 484 | 383 |
| 2023-08-18 | 131 | 484 | 385 |
| 2023-08-21 | 129 | 482 | 383 |
| 2023-08-22 | 128 | 476 | 381 |
| 2023-08-23 | 126 | 473 | 381 |
| 2023-08-24 | 124 | 474 | 376 |
| 2023-08-25 | 125 | 476 | 378 |
| 2023-08-28 | 123 | 474 | 377 |